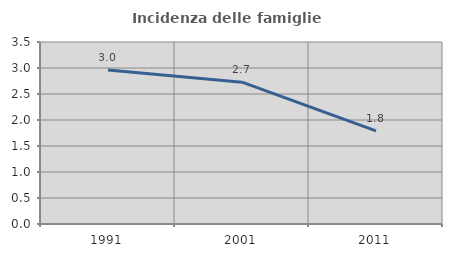
| Category | Incidenza delle famiglie numerose |
|---|---|
| 1991.0 | 2.961 |
| 2001.0 | 2.727 |
| 2011.0 | 1.79 |